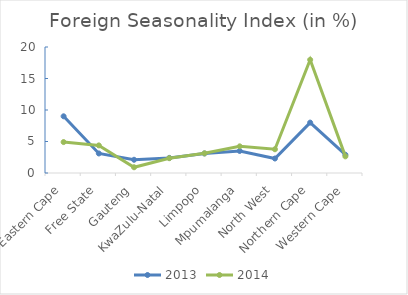
| Category | 2013 | 2014 |
|---|---|---|
| Eastern Cape | 9 | 4.91 |
| Free State | 3.1 | 4.38 |
| Gauteng | 2.1 | 0.91 |
| KwaZulu-Natal | 2.4 | 2.35 |
| Limpopo | 3.1 | 3.12 |
| Mpumalanga | 3.5 | 4.23 |
| North West | 2.3 | 3.77 |
| Northern Cape | 8 | 17.97 |
| Western Cape | 2.9 | 2.64 |